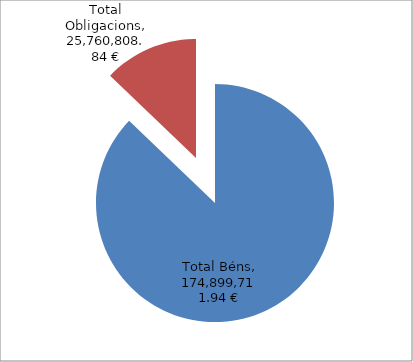
| Category | Series 0 |
|---|---|
| Total Béns | 174899711.94 |
| Total Obligacions | 25760808.84 |